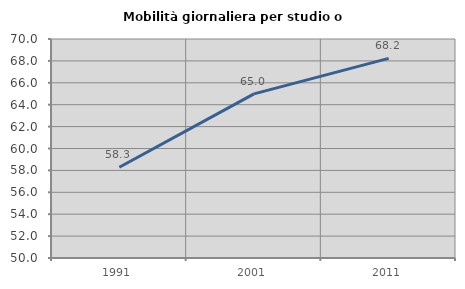
| Category | Mobilità giornaliera per studio o lavoro |
|---|---|
| 1991.0 | 58.288 |
| 2001.0 | 64.99 |
| 2011.0 | 68.228 |